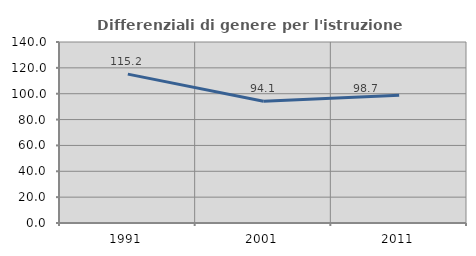
| Category | Differenziali di genere per l'istruzione superiore |
|---|---|
| 1991.0 | 115.153 |
| 2001.0 | 94.128 |
| 2011.0 | 98.722 |